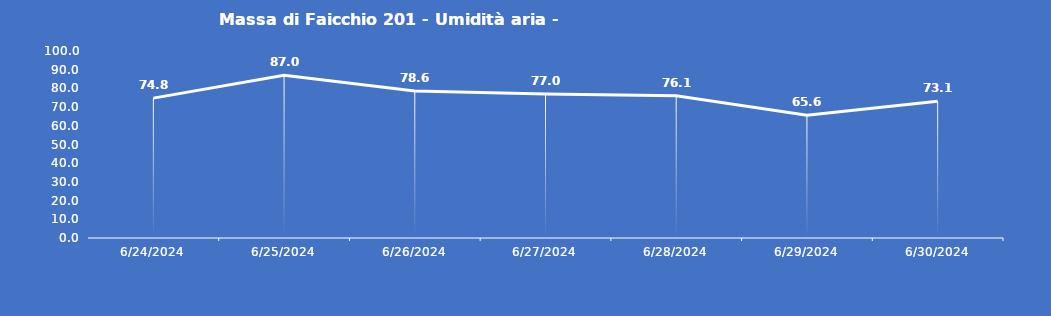
| Category | Massa di Faicchio 201 - Umidità aria - Grezzo (%) |
|---|---|
| 6/24/24 | 74.8 |
| 6/25/24 | 87 |
| 6/26/24 | 78.6 |
| 6/27/24 | 77 |
| 6/28/24 | 76.1 |
| 6/29/24 | 65.6 |
| 6/30/24 | 73.1 |